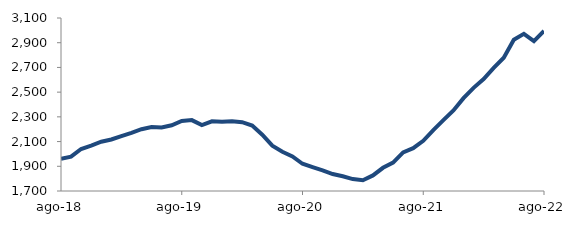
| Category | Series 0 |
|---|---|
| 2018-08-01 | 1961.029 |
| 2018-09-01 | 1978.317 |
| 2018-10-01 | 2039.821 |
| 2018-11-01 | 2068.002 |
| 2018-12-01 | 2098.706 |
| 2019-01-01 | 2116.727 |
| 2019-02-01 | 2144.876 |
| 2019-03-01 | 2171.077 |
| 2019-04-01 | 2199.941 |
| 2019-05-01 | 2218.125 |
| 2019-06-01 | 2213.708 |
| 2019-07-01 | 2231.834 |
| 2019-08-01 | 2267.321 |
| 2019-09-01 | 2273.768 |
| 2019-10-01 | 2233.304 |
| 2019-11-01 | 2263.898 |
| 2019-12-01 | 2259.926 |
| 2020-01-01 | 2265.053 |
| 2020-02-01 | 2256.766 |
| 2020-03-01 | 2229.161 |
| 2020-04-01 | 2155.791 |
| 2020-05-01 | 2066.843 |
| 2020-06-01 | 2018.026 |
| 2020-07-01 | 1979.558 |
| 2020-08-01 | 1920.368 |
| 2020-09-01 | 1893.237 |
| 2020-10-01 | 1867.4 |
| 2020-11-01 | 1837.195 |
| 2020-12-01 | 1819.546 |
| 2021-01-01 | 1796.45 |
| 2021-02-01 | 1786.603 |
| 2021-03-01 | 1826.072 |
| 2021-04-01 | 1887.798 |
| 2021-05-01 | 1930.372 |
| 2021-06-01 | 2012.926 |
| 2021-07-01 | 2046.434 |
| 2021-08-01 | 2105.806 |
| 2021-09-01 | 2192.514 |
| 2021-10-01 | 2272.972 |
| 2021-11-01 | 2351.334 |
| 2021-12-01 | 2451.171 |
| 2022-01-01 | 2534.613 |
| 2022-02-01 | 2606.357 |
| 2022-03-01 | 2696.948 |
| 2022-04-01 | 2778.264 |
| 2022-05-01 | 2924.682 |
| 2022-06-01 | 2972.281 |
| 2022-07-01 | 2912.933 |
| 2022-08-01 | 2994.913 |